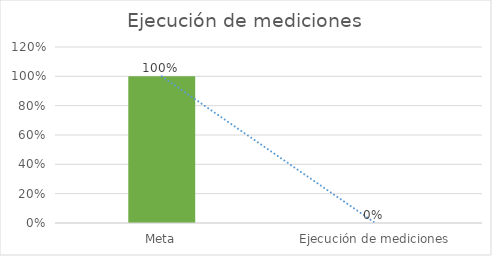
| Category | Series 0 |
|---|---|
| Meta | 1 |
| Ejecución de mediciones | 0 |